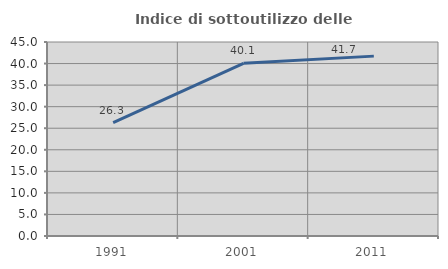
| Category | Indice di sottoutilizzo delle abitazioni  |
|---|---|
| 1991.0 | 26.298 |
| 2001.0 | 40.058 |
| 2011.0 | 41.724 |